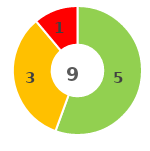
| Category | Series 0 |
|---|---|
| 0 | 0 |
| 1 | 5 |
| 2 | 3 |
| 3 | 1 |
| 4 | 0 |